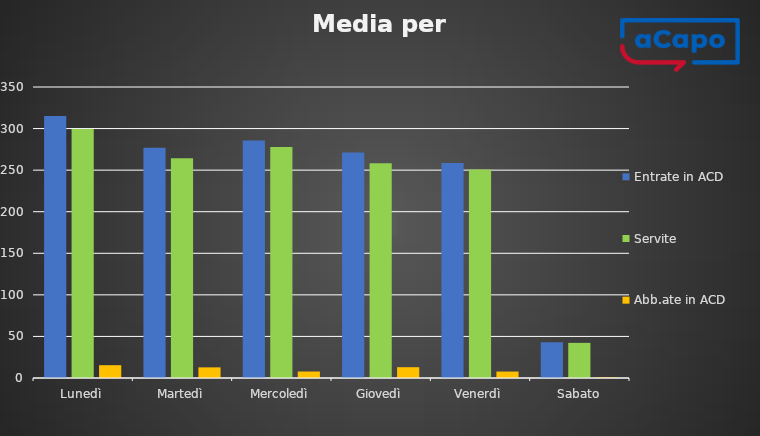
| Category | Entrate in ACD | Servite | Abb.ate in ACD |
|---|---|---|---|
| Lunedì | 315 | 299.6 | 15.4 |
| Martedì | 277 | 264.2 | 12.8 |
| Mercoledì | 285.6 | 277.8 | 7.8 |
| Giovedì | 271.25 | 258.25 | 13 |
| Venerdì | 258.5 | 250.75 | 7.75 |
| Sabato | 43 | 42.25 | 0.75 |